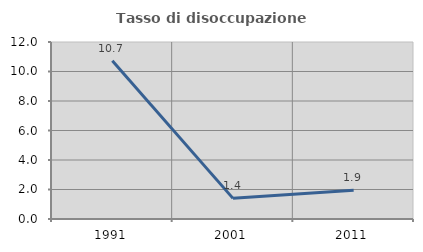
| Category | Tasso di disoccupazione giovanile  |
|---|---|
| 1991.0 | 10.732 |
| 2001.0 | 1.399 |
| 2011.0 | 1.948 |